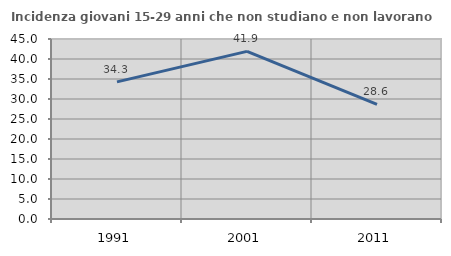
| Category | Incidenza giovani 15-29 anni che non studiano e non lavorano  |
|---|---|
| 1991.0 | 34.286 |
| 2001.0 | 41.912 |
| 2011.0 | 28.631 |